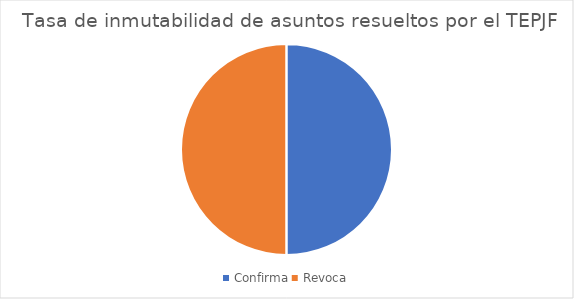
| Category | Tasa de inmutabilidad de asuntos resueltos por el TEPJF |
|---|---|
| Confirma | 2 |
| Revoca | 2 |